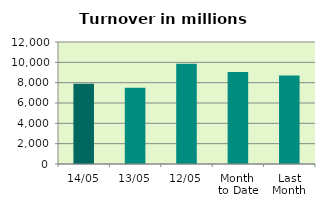
| Category | Series 0 |
|---|---|
| 14/05 | 7891.963 |
| 13/05 | 7494.062 |
| 12/05 | 9857.685 |
| Month 
to Date | 9054.452 |
| Last
Month | 8713.977 |